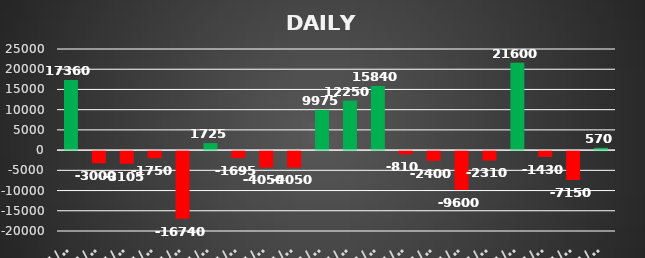
| Category | Series 0 |
|---|---|
| 2023-01-02 | 17360 |
| 2023-01-03 | -3000 |
| 2023-01-04 | -3105 |
| 2023-01-05 | -1750 |
| 2023-01-06 | -16740 |
| 2023-01-09 | 1725 |
| 2023-01-10 | -1695 |
| 2023-01-10 | -4050 |
| 2023-01-11 | -4050 |
| 2023-01-12 | 9975 |
| 2023-01-13 | 12250 |
| 2023-01-16 | 15840 |
| 2023-01-17 | -810 |
| 2023-01-17 | -2400 |
| 2023-01-18 | -9600 |
| 2023-01-19 | -2310 |
| 2023-01-19 | 21600 |
| 2023-01-20 | -1430 |
| 2023-01-23 | -7150 |
| 2023-01-24 | 570 |